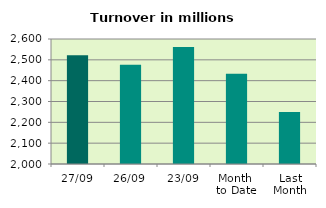
| Category | Series 0 |
|---|---|
| 27/09 | 2521.439 |
| 26/09 | 2476.921 |
| 23/09 | 2561.083 |
| Month 
to Date | 2433.666 |
| Last
Month | 2249.305 |